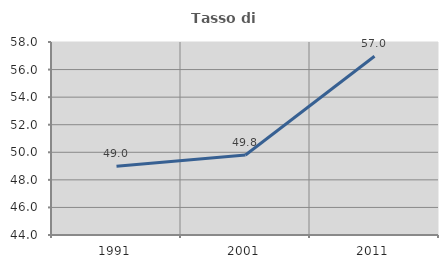
| Category | Tasso di occupazione   |
|---|---|
| 1991.0 | 48.995 |
| 2001.0 | 49.805 |
| 2011.0 | 56.966 |